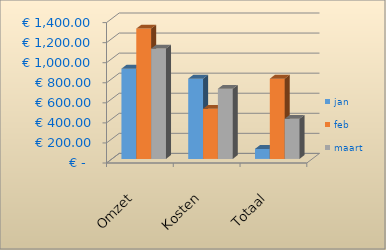
| Category | jan | feb | maart |
|---|---|---|---|
|  Omzet  | 900 | 1300 | 1100 |
|  Kosten  | 800 | 500 | 700 |
|  Totaal  | 100 | 800 | 400 |